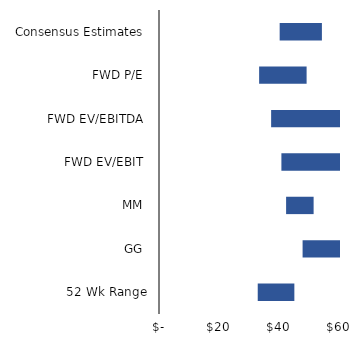
| Category | Q1 | Diff | Q3 |
|---|---|---|---|
| 52 Wk Range | 32.73 | 12.14 | 44.87 |
|  GG  | 47.6 | 21.52 | 69.12 |
|  MM  | 42.131 | 9.123 | 51.254 |
|  FWD EV/EBIT  | 40.574 | 33.333 | 73.907 |
|  FWD EV/EBITDA  | 37.171 | 31.983 | 69.154 |
|  FWD P/E  | 33.192 | 15.74 | 48.932 |
|  Consensus Estimates  | 40 | 14 | 54 |